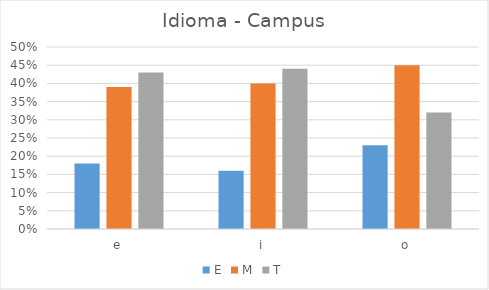
| Category | E | M | T |
|---|---|---|---|
| e | 0.18 | 0.39 | 0.43 |
| i | 0.16 | 0.4 | 0.44 |
| o | 0.23 | 0.45 | 0.32 |